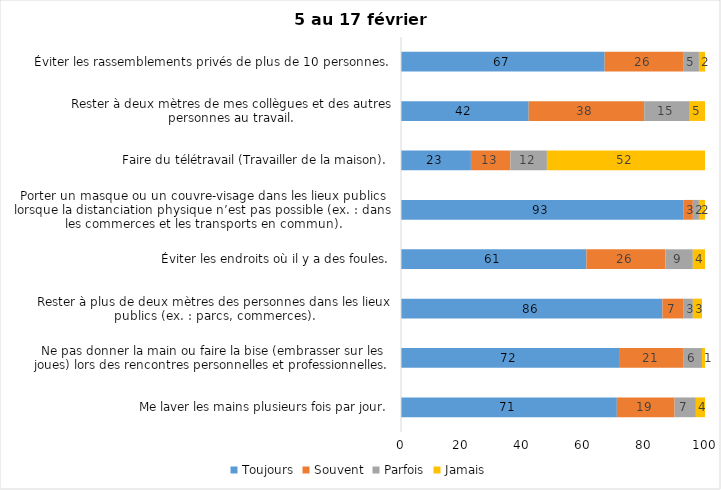
| Category | Toujours | Souvent | Parfois | Jamais |
|---|---|---|---|---|
| Me laver les mains plusieurs fois par jour. | 71 | 19 | 7 | 4 |
| Ne pas donner la main ou faire la bise (embrasser sur les joues) lors des rencontres personnelles et professionnelles. | 72 | 21 | 6 | 1 |
| Rester à plus de deux mètres des personnes dans les lieux publics (ex. : parcs, commerces). | 86 | 7 | 3 | 3 |
| Éviter les endroits où il y a des foules. | 61 | 26 | 9 | 4 |
| Porter un masque ou un couvre-visage dans les lieux publics lorsque la distanciation physique n’est pas possible (ex. : dans les commerces et les transports en commun). | 93 | 3 | 2 | 2 |
| Faire du télétravail (Travailler de la maison). | 23 | 13 | 12 | 52 |
| Rester à deux mètres de mes collègues et des autres personnes au travail. | 42 | 38 | 15 | 5 |
| Éviter les rassemblements privés de plus de 10 personnes. | 67 | 26 | 5 | 2 |